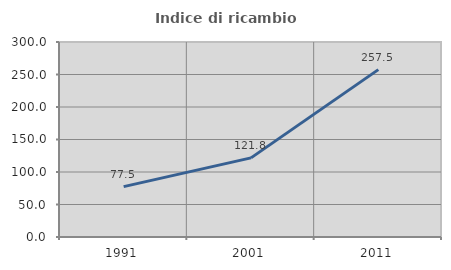
| Category | Indice di ricambio occupazionale  |
|---|---|
| 1991.0 | 77.45 |
| 2001.0 | 121.753 |
| 2011.0 | 257.5 |